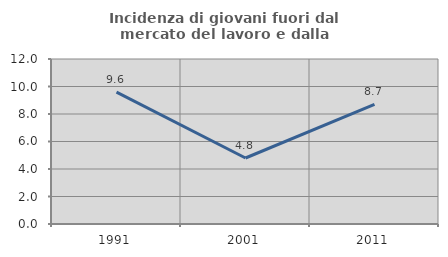
| Category | Incidenza di giovani fuori dal mercato del lavoro e dalla formazione  |
|---|---|
| 1991.0 | 9.589 |
| 2001.0 | 4.8 |
| 2011.0 | 8.696 |